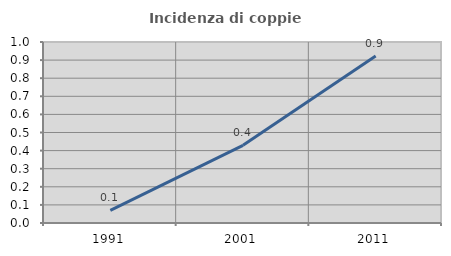
| Category | Incidenza di coppie miste |
|---|---|
| 1991.0 | 0.07 |
| 2001.0 | 0.429 |
| 2011.0 | 0.922 |